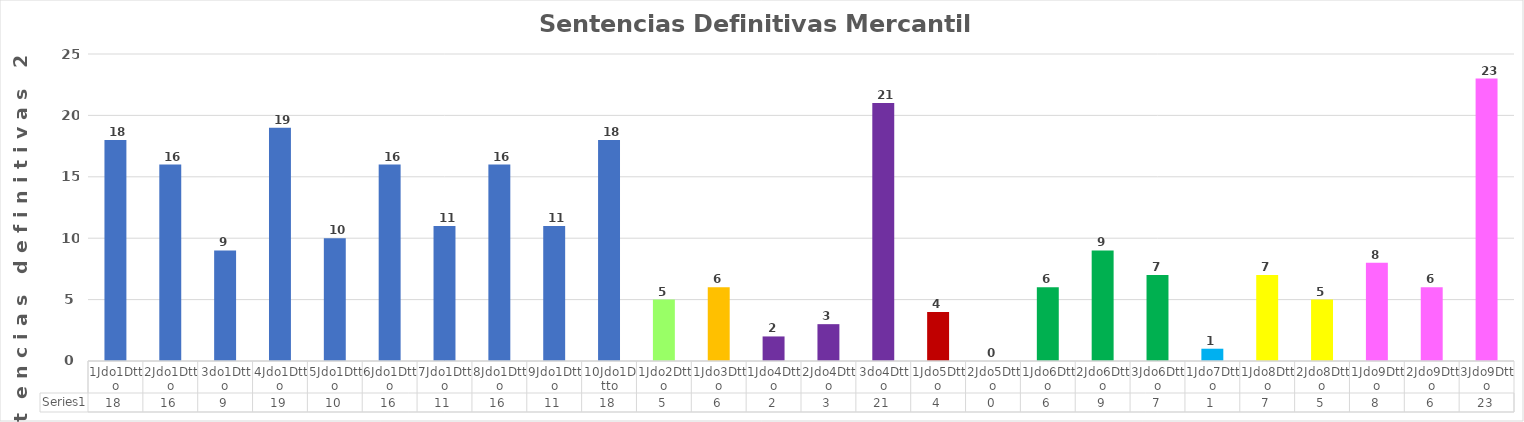
| Category | Series 0 |
|---|---|
| 1Jdo1Dtto | 18 |
| 2Jdo1Dtto | 16 |
| 3do1Dtto | 9 |
| 4Jdo1Dtto | 19 |
| 5Jdo1Dtto | 10 |
| 6Jdo1Dtto | 16 |
| 7Jdo1Dtto | 11 |
| 8Jdo1Dtto | 16 |
| 9Jdo1Dtto | 11 |
| 10Jdo1Dtto | 18 |
| 1Jdo2Dtto | 5 |
| 1Jdo3Dtto | 6 |
| 1Jdo4Dtto | 2 |
| 2Jdo4Dtto | 3 |
| 3do4Dtto | 21 |
| 1Jdo5Dtto | 4 |
| 2Jdo5Dtto | 0 |
| 1Jdo6Dtto | 6 |
| 2Jdo6Dtto | 9 |
| 3Jdo6Dtto | 7 |
| 1Jdo7Dtto | 1 |
| 1Jdo8Dtto | 7 |
| 2Jdo8Dtto | 5 |
| 1Jdo9Dtto | 8 |
| 2Jdo9Dtto | 6 |
| 3Jdo9Dtto | 23 |